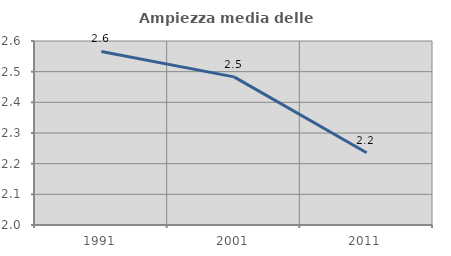
| Category | Ampiezza media delle famiglie |
|---|---|
| 1991.0 | 2.566 |
| 2001.0 | 2.483 |
| 2011.0 | 2.236 |